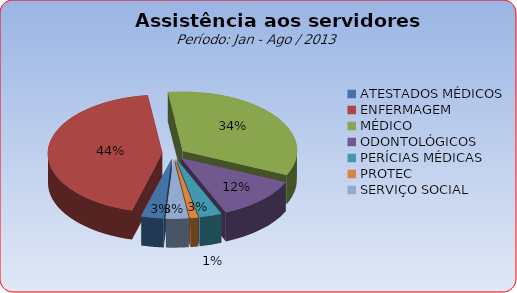
| Category | Series 0 |
|---|---|
| ATESTADOS MÉDICOS | 3.151 |
| ENFERMAGEM | 43.681 |
| MÉDICO | 33.784 |
| ODONTOLÓGICOS | 11.908 |
| PERÍCIAS MÉDICAS | 3.168 |
| PROTEC | 1.121 |
| SERVIÇO SOCIAL | 3.186 |